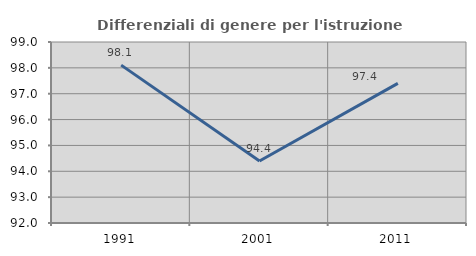
| Category | Differenziali di genere per l'istruzione superiore |
|---|---|
| 1991.0 | 98.105 |
| 2001.0 | 94.398 |
| 2011.0 | 97.399 |